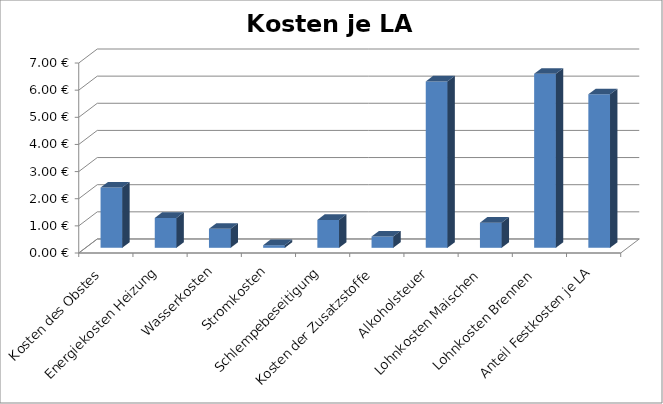
| Category | Kosten je LA Rohbrand |
|---|---|
| Kosten des Obstes | 2.222 |
| Energiekosten Heizung | 1.1 |
| Wasserkosten | 0.7 |
| Stromkosten | 0.096 |
| Schlempebeseitigung | 1.026 |
| Kosten der Zusatzstoffe | 0.417 |
| Alkoholsteuer | 6.132 |
| Lohnkosten Maischen | 0.926 |
| Lohnkosten Brennen | 6.41 |
| Anteil Festkosten je LA | 5.657 |